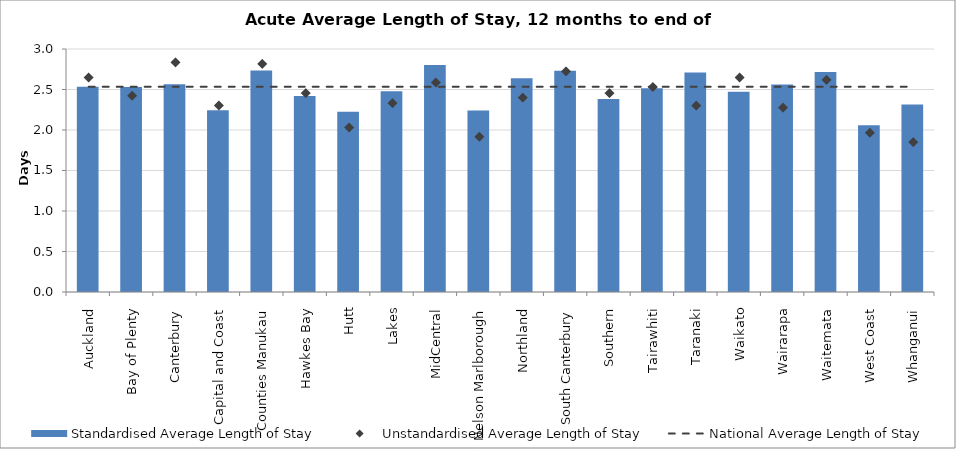
| Category | Standardised Average Length of Stay |
|---|---|
| Auckland | 2.535 |
| Bay of Plenty | 2.529 |
| Canterbury | 2.564 |
| Capital and Coast | 2.243 |
| Counties Manukau | 2.735 |
| Hawkes Bay | 2.418 |
| Hutt | 2.226 |
| Lakes | 2.479 |
| MidCentral | 2.802 |
| Nelson Marlborough | 2.242 |
| Northland | 2.64 |
| South Canterbury | 2.732 |
| Southern | 2.383 |
| Tairawhiti | 2.514 |
| Taranaki | 2.711 |
| Waikato | 2.471 |
| Wairarapa | 2.562 |
| Waitemata | 2.715 |
| West Coast | 2.06 |
| Whanganui | 2.314 |